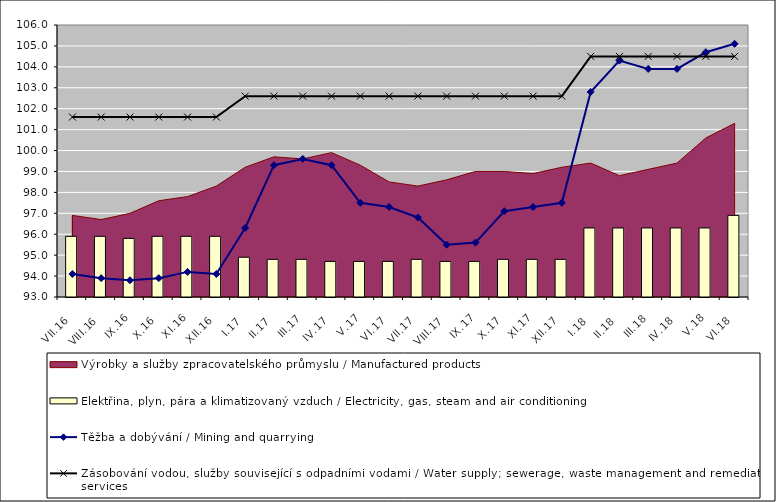
| Category | Elektřina, plyn, pára a klimatizovaný vzduch / Electricity, gas, steam and air conditioning |
|---|---|
| VII.16 | 95.9 |
| VIII.16 | 95.9 |
| IX.16 | 95.8 |
| X.16 | 95.9 |
| XI.16 | 95.9 |
| XII.16 | 95.9 |
| I.17 | 94.9 |
| II.17 | 94.8 |
| III.17 | 94.8 |
| IV.17 | 94.7 |
| V.17 | 94.7 |
| VI.17 | 94.7 |
| VII.17 | 94.8 |
| VIII.17 | 94.7 |
| IX.17 | 94.7 |
| X.17 | 94.8 |
| XI.17 | 94.8 |
| XII.17 | 94.8 |
| I.18 | 96.3 |
| II.18 | 96.3 |
| III.18 | 96.3 |
| IV.18 | 96.3 |
| V.18 | 96.3 |
| VI.18 | 96.9 |